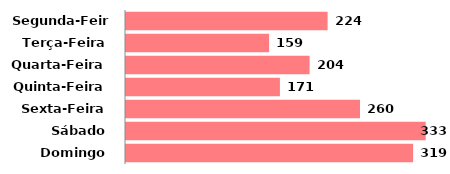
| Category | Qtde |
|---|---|
| Segunda-Feira | 224 |
| Terça-Feira | 159 |
| Quarta-Feira | 204 |
| Quinta-Feira | 171 |
| Sexta-Feira | 260 |
| Sábado | 333 |
| Domingo | 319 |